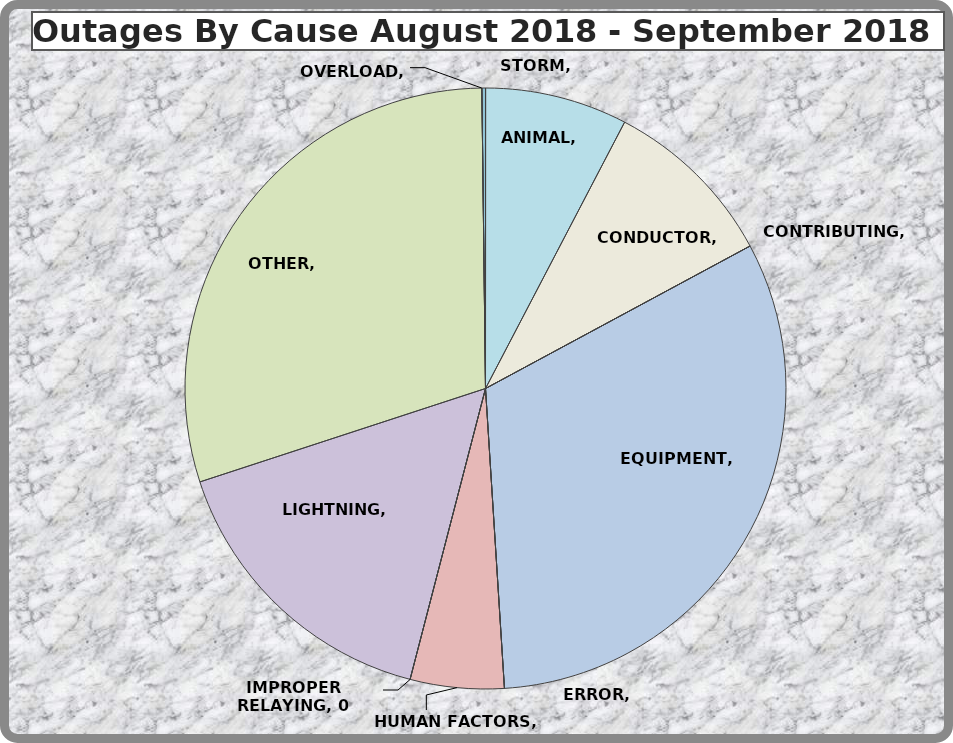
| Category | Series 0 |
|---|---|
| ANIMAL | 38 |
| CONDUCTOR | 47 |
| CONTRIBUTING | 0 |
| EQUIPMENT | 158 |
| ERROR | 0 |
| HUMAN FACTORS | 25 |
| IMPROPER RELAYING | 0 |
| LIGHTNING | 79 |
| OTHER | 148 |
| OVERLOAD | 0 |
| STORM | 1 |